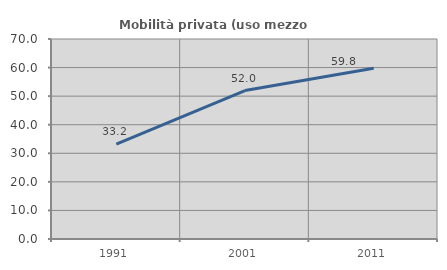
| Category | Mobilità privata (uso mezzo privato) |
|---|---|
| 1991.0 | 33.244 |
| 2001.0 | 51.969 |
| 2011.0 | 59.778 |